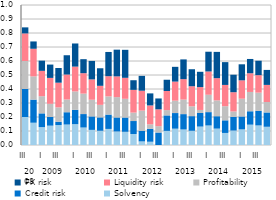
| Category | Solvency | Credit risk | Profitability | Liquidity risk | FX risk |
|---|---|---|---|---|---|
| 0 | 0.2 | 0.2 | 0.2 | 0.197 | 0.043 |
| 1 | 0.159 | 0.165 | 0.166 | 0.197 | 0.052 |
| 2 | 0.128 | 0.098 | 0.123 | 0.181 | 0.073 |
| 3 | 0.138 | 0.062 | 0.094 | 0.185 | 0.095 |
| 4 | 0.142 | 0.024 | 0.103 | 0.176 | 0.105 |
| 5 | 0.146 | 0.088 | 0.091 | 0.178 | 0.138 |
| 6 | 0.149 | 0.102 | 0.132 | 0.177 | 0.165 |
| 7 | 0.125 | 0.096 | 0.146 | 0.146 | 0.1 |
| 8 | 0.108 | 0.096 | 0.119 | 0.145 | 0.132 |
| 9 | 0.102 | 0.096 | 0.089 | 0.136 | 0.125 |
| 10 | 0.115 | 0.102 | 0.13 | 0.144 | 0.173 |
| 11 | 0.097 | 0.1 | 0.145 | 0.148 | 0.191 |
| 12 | 0.094 | 0.102 | 0.134 | 0.15 | 0.2 |
| 13 | 0.079 | 0.092 | 0.06 | 0.162 | 0.069 |
| 14 | 0.026 | 0.076 | 0.144 | 0.142 | 0.106 |
| 15 | 0.023 | 0.093 | 0.032 | 0.135 | 0.086 |
| 16 | 0 | 0.089 | 0.046 | 0.12 | 0.078 |
| 17 | 0.101 | 0.111 | 0.038 | 0.136 | 0.081 |
| 18 | 0.117 | 0.112 | 0.088 | 0.136 | 0.106 |
| 19 | 0.111 | 0.11 | 0.104 | 0.146 | 0.141 |
| 20 | 0.102 | 0.105 | 0.07 | 0.143 | 0.121 |
| 21 | 0.132 | 0.097 | 0.022 | 0.163 | 0.109 |
| 22 | 0.139 | 0.095 | 0.124 | 0.166 | 0.141 |
| 23 | 0.117 | 0.088 | 0.113 | 0.159 | 0.188 |
| 24 | 0.086 | 0.09 | 0.101 | 0.152 | 0.163 |
| 25 | 0.103 | 0.097 | 0.039 | 0.138 | 0.125 |
| 26 | 0.112 | 0.092 | 0.127 | 0.131 | 0.115 |
| 27 | 0.145 | 0.096 | 0.138 | 0.134 | 0.102 |
| 28 | 0.14 | 0.104 | 0.13 | 0.125 | 0.103 |
| 29 | 0.13 | 0.102 | 0.075 | 0.122 | 0.107 |